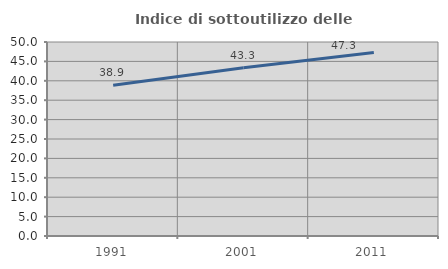
| Category | Indice di sottoutilizzo delle abitazioni  |
|---|---|
| 1991.0 | 38.857 |
| 2001.0 | 43.35 |
| 2011.0 | 47.291 |